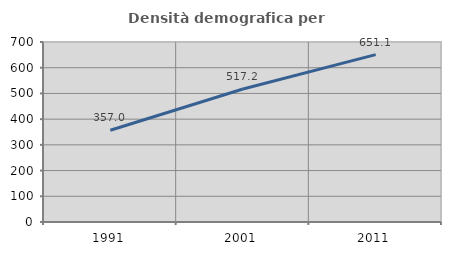
| Category | Densità demografica |
|---|---|
| 1991.0 | 357.029 |
| 2001.0 | 517.194 |
| 2011.0 | 651.053 |